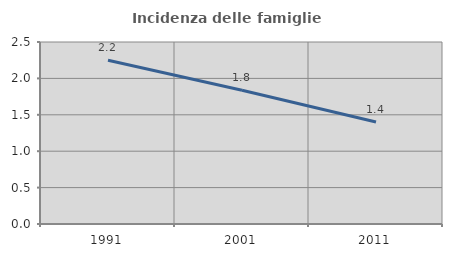
| Category | Incidenza delle famiglie numerose |
|---|---|
| 1991.0 | 2.249 |
| 2001.0 | 1.837 |
| 2011.0 | 1.402 |